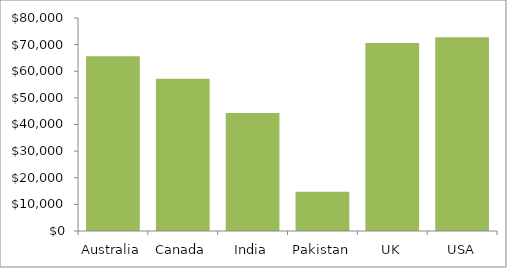
| Category | Total |
|---|---|
| Australia | 65673.284 |
| Canada | 57184.91 |
| India | 44332.756 |
| Pakistan | 14701.319 |
| UK | 70609.175 |
| USA | 72746.644 |